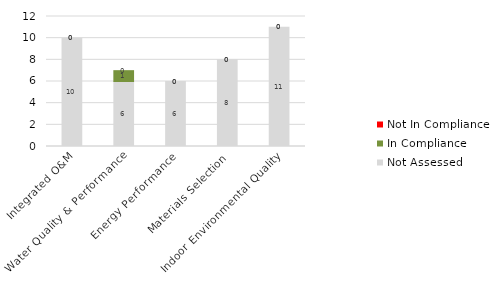
| Category | Not Assessed | In Compliance | Not In Compliance |
|---|---|---|---|
| Integrated O&M | 10 | 0 | 0 |
| Water Quality & Performance | 6 | 1 | 0 |
| Energy Performance | 6 | 0 | 0 |
| Materials Selection | 8 | 0 | 0 |
| Indoor Environmental Quality | 11 | 0 | 0 |